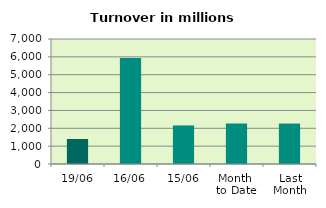
| Category | Series 0 |
|---|---|
| 19/06 | 1400.376 |
| 16/06 | 5935.752 |
| 15/06 | 2160.29 |
| Month 
to Date | 2267.663 |
| Last
Month | 2265.206 |